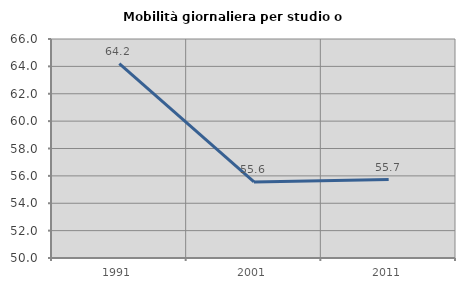
| Category | Mobilità giornaliera per studio o lavoro |
|---|---|
| 1991.0 | 64.196 |
| 2001.0 | 55.556 |
| 2011.0 | 55.732 |